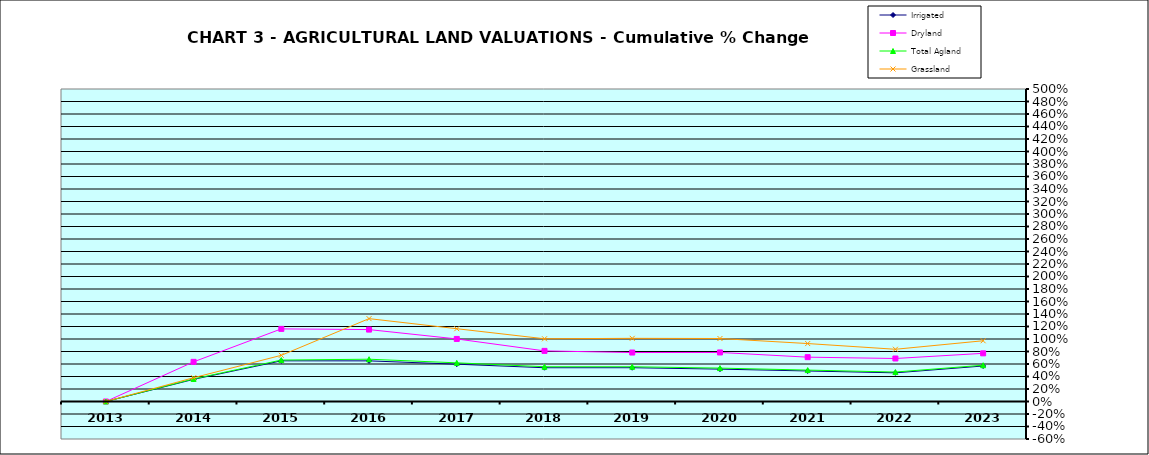
| Category | Irrigated | Dryland | Total Agland | Grassland |
|---|---|---|---|---|
| 2013.0 | 0 | 0 | 0 | 0 |
| 2014.0 | 0.354 | 0.634 | 0.361 | 0.38 |
| 2015.0 | 0.651 | 1.162 | 0.663 | 0.739 |
| 2016.0 | 0.65 | 1.151 | 0.677 | 1.326 |
| 2017.0 | 0.597 | 1.001 | 0.619 | 1.165 |
| 2018.0 | 0.54 | 0.81 | 0.556 | 1.004 |
| 2019.0 | 0.54 | 0.783 | 0.556 | 1.011 |
| 2020.0 | 0.518 | 0.785 | 0.534 | 1.008 |
| 2021.0 | 0.488 | 0.709 | 0.503 | 0.927 |
| 2022.0 | 0.459 | 0.688 | 0.471 | 0.836 |
| 2023.0 | 0.568 | 0.771 | 0.58 | 0.972 |